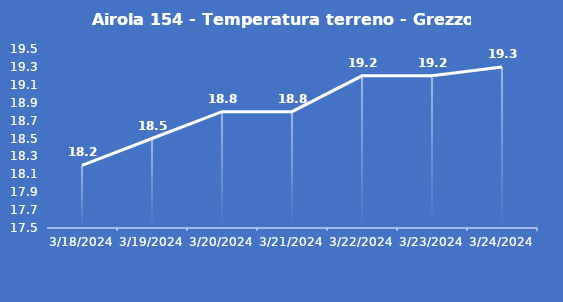
| Category | Airola 154 - Temperatura terreno - Grezzo (°C) |
|---|---|
| 3/18/24 | 18.2 |
| 3/19/24 | 18.5 |
| 3/20/24 | 18.8 |
| 3/21/24 | 18.8 |
| 3/22/24 | 19.2 |
| 3/23/24 | 19.2 |
| 3/24/24 | 19.3 |